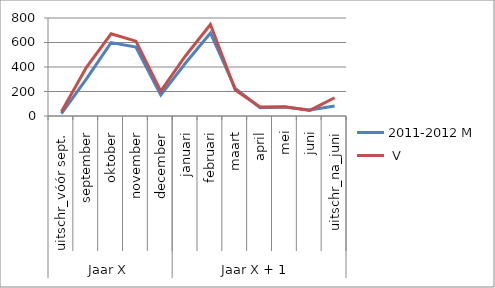
| Category | 2011-2012 |
|---|---|
| 0 | 34 |
| 1 | 395 |
| 2 | 671 |
| 3 | 611 |
| 4 | 203 |
| 5 | 492 |
| 6 | 747 |
| 7 | 213 |
| 8 | 73 |
| 9 | 76 |
| 10 | 46 |
| 11 | 149 |